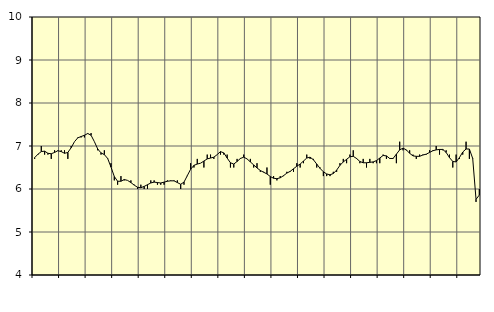
| Category | Piggar | Transport, SNI 49-53 |
|---|---|---|
| nan | 6.7 | 6.73 |
| 87.0 | 6.8 | 6.81 |
| 87.0 | 7 | 6.87 |
| 87.0 | 6.8 | 6.88 |
| nan | 6.8 | 6.83 |
| 88.0 | 6.7 | 6.82 |
| 88.0 | 6.9 | 6.85 |
| 88.0 | 6.9 | 6.89 |
| nan | 6.9 | 6.87 |
| 89.0 | 6.9 | 6.83 |
| 89.0 | 6.7 | 6.85 |
| 89.0 | 7 | 6.96 |
| nan | 7.1 | 7.1 |
| 90.0 | 7.2 | 7.19 |
| 90.0 | 7.2 | 7.22 |
| 90.0 | 7.2 | 7.25 |
| nan | 7.3 | 7.29 |
| 91.0 | 7.3 | 7.25 |
| 91.0 | 7.1 | 7.1 |
| 91.0 | 6.9 | 6.93 |
| nan | 6.8 | 6.84 |
| 92.0 | 6.9 | 6.8 |
| 92.0 | 6.7 | 6.71 |
| 92.0 | 6.6 | 6.51 |
| nan | 6.2 | 6.29 |
| 93.0 | 6.1 | 6.18 |
| 93.0 | 6.3 | 6.18 |
| 93.0 | 6.2 | 6.22 |
| nan | 6.2 | 6.2 |
| 94.0 | 6.2 | 6.15 |
| 94.0 | 6.1 | 6.09 |
| 94.0 | 6 | 6.04 |
| nan | 6.1 | 6.03 |
| 95.0 | 6 | 6.06 |
| 95.0 | 6 | 6.1 |
| 95.0 | 6.2 | 6.14 |
| nan | 6.2 | 6.16 |
| 96.0 | 6.1 | 6.15 |
| 96.0 | 6.1 | 6.14 |
| 96.0 | 6.1 | 6.16 |
| nan | 6.2 | 6.18 |
| 97.0 | 6.2 | 6.19 |
| 97.0 | 6.2 | 6.19 |
| 97.0 | 6.2 | 6.15 |
| nan | 6 | 6.11 |
| 98.0 | 6.1 | 6.16 |
| 98.0 | 6.3 | 6.31 |
| 98.0 | 6.6 | 6.46 |
| nan | 6.5 | 6.55 |
| 99.0 | 6.7 | 6.58 |
| 99.0 | 6.6 | 6.6 |
| 99.0 | 6.5 | 6.65 |
| nan | 6.8 | 6.7 |
| 0.0 | 6.8 | 6.72 |
| 0.0 | 6.7 | 6.74 |
| 0.0 | 6.8 | 6.8 |
| nan | 6.8 | 6.87 |
| 1.0 | 6.8 | 6.84 |
| 1.0 | 6.8 | 6.72 |
| 1.0 | 6.5 | 6.61 |
| nan | 6.5 | 6.58 |
| 2.0 | 6.7 | 6.64 |
| 2.0 | 6.7 | 6.71 |
| 2.0 | 6.8 | 6.74 |
| nan | 6.7 | 6.7 |
| 3.0 | 6.7 | 6.63 |
| 3.0 | 6.5 | 6.56 |
| 3.0 | 6.6 | 6.49 |
| nan | 6.4 | 6.43 |
| 4.0 | 6.4 | 6.39 |
| 4.0 | 6.5 | 6.35 |
| 4.0 | 6.1 | 6.29 |
| nan | 6.3 | 6.25 |
| 5.0 | 6.2 | 6.24 |
| 5.0 | 6.3 | 6.26 |
| 5.0 | 6.3 | 6.31 |
| nan | 6.4 | 6.37 |
| 6.0 | 6.4 | 6.41 |
| 6.0 | 6.4 | 6.47 |
| 6.0 | 6.6 | 6.53 |
| nan | 6.5 | 6.58 |
| 7.0 | 6.6 | 6.65 |
| 7.0 | 6.8 | 6.72 |
| 7.0 | 6.7 | 6.74 |
| nan | 6.7 | 6.68 |
| 8.0 | 6.5 | 6.58 |
| 8.0 | 6.5 | 6.48 |
| 8.0 | 6.3 | 6.4 |
| nan | 6.3 | 6.35 |
| 9.0 | 6.3 | 6.33 |
| 9.0 | 6.4 | 6.36 |
| 9.0 | 6.4 | 6.44 |
| nan | 6.6 | 6.55 |
| 10.0 | 6.7 | 6.63 |
| 10.0 | 6.6 | 6.69 |
| 10.0 | 6.8 | 6.75 |
| nan | 6.9 | 6.76 |
| 11.0 | 6.7 | 6.71 |
| 11.0 | 6.6 | 6.64 |
| 11.0 | 6.7 | 6.61 |
| nan | 6.5 | 6.61 |
| 12.0 | 6.7 | 6.62 |
| 12.0 | 6.6 | 6.63 |
| 12.0 | 6.6 | 6.66 |
| nan | 6.6 | 6.72 |
| 13.0 | 6.8 | 6.78 |
| 13.0 | 6.7 | 6.77 |
| 13.0 | 6.7 | 6.71 |
| nan | 6.7 | 6.71 |
| 14.0 | 6.6 | 6.81 |
| 14.0 | 7.1 | 6.91 |
| 14.0 | 6.9 | 6.95 |
| nan | 6.9 | 6.91 |
| 15.0 | 6.9 | 6.83 |
| 15.0 | 6.8 | 6.77 |
| 15.0 | 6.7 | 6.76 |
| nan | 6.8 | 6.76 |
| 16.0 | 6.8 | 6.79 |
| 16.0 | 6.8 | 6.81 |
| 16.0 | 6.9 | 6.85 |
| nan | 6.9 | 6.89 |
| 17.0 | 7 | 6.91 |
| 17.0 | 6.8 | 6.92 |
| 17.0 | 6.9 | 6.92 |
| nan | 6.9 | 6.85 |
| 18.0 | 6.8 | 6.73 |
| 18.0 | 6.5 | 6.64 |
| 18.0 | 6.8 | 6.63 |
| nan | 6.7 | 6.73 |
| 19.0 | 6.8 | 6.86 |
| 19.0 | 7.1 | 6.93 |
| 19.0 | 6.7 | 6.93 |
| nan | 6.7 | 6.71 |
| 20.0 | 5.7 | 5.76 |
| 20.0 | 6 | 5.86 |